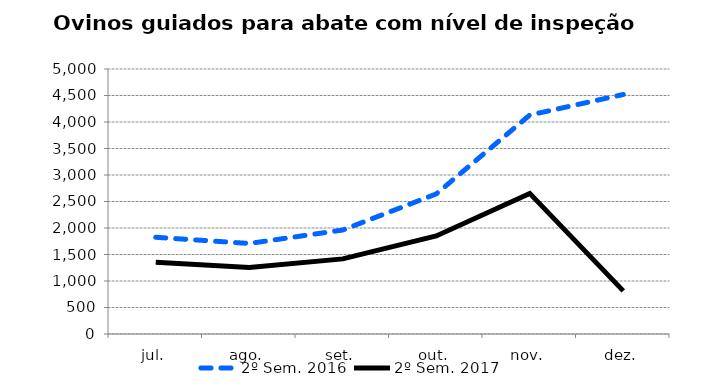
| Category | 2º Sem. 2016 | 2º Sem. 2017 |
|---|---|---|
| jul. | 1825 | 1356 |
| ago. | 1708 | 1255 |
| set. | 1962 | 1417 |
| out. | 2643 | 1850 |
| nov. | 4131 | 2653 |
| dez. | 4519 | 814 |